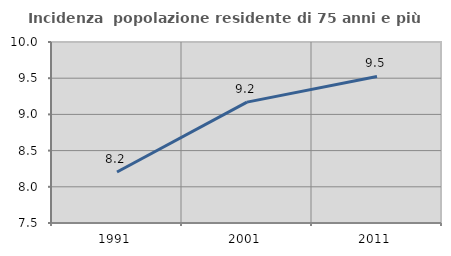
| Category | Incidenza  popolazione residente di 75 anni e più |
|---|---|
| 1991.0 | 8.204 |
| 2001.0 | 9.17 |
| 2011.0 | 9.524 |